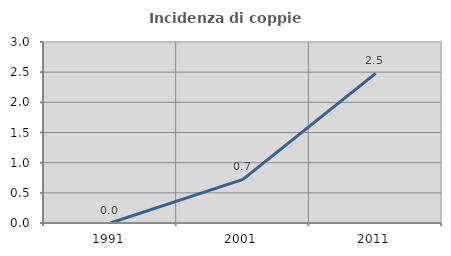
| Category | Incidenza di coppie miste |
|---|---|
| 1991.0 | 0 |
| 2001.0 | 0.722 |
| 2011.0 | 2.479 |